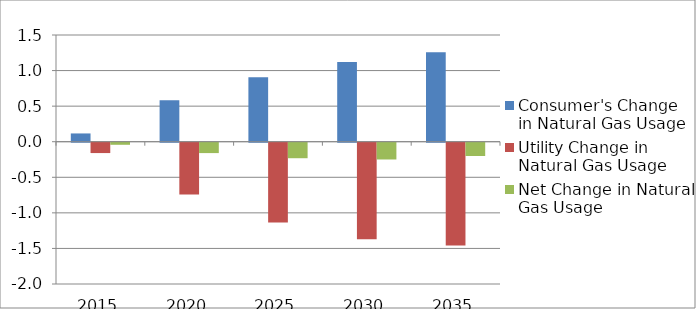
| Category | Consumer's Change in Natural Gas Usage | Utility Change in Natural Gas Usage | Net Change in Natural Gas Usage |
|---|---|---|---|
| 2015.0 | 0.116 | -0.146 | -0.029 |
| 2020.0 | 0.584 | -0.73 | -0.146 |
| 2025.0 | 0.905 | -1.122 | -0.218 |
| 2030.0 | 1.12 | -1.356 | -0.236 |
| 2035.0 | 1.258 | -1.445 | -0.187 |